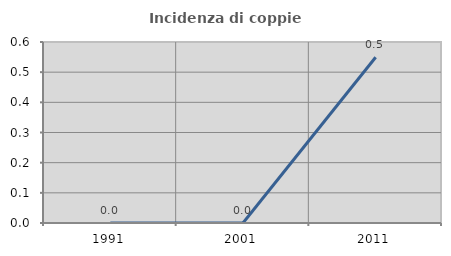
| Category | Incidenza di coppie miste |
|---|---|
| 1991.0 | 0 |
| 2001.0 | 0 |
| 2011.0 | 0.549 |